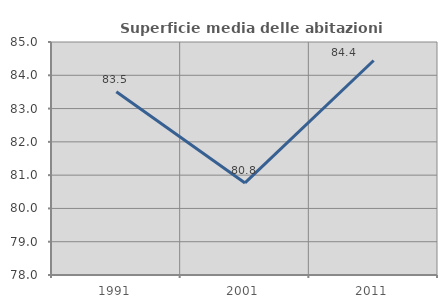
| Category | Superficie media delle abitazioni occupate |
|---|---|
| 1991.0 | 83.505 |
| 2001.0 | 80.765 |
| 2011.0 | 84.443 |